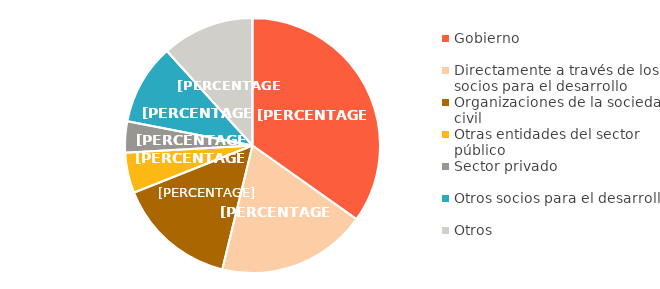
| Category | Series 0 |
|---|---|
| Gobierno | 1161 |
| Directamente a través de los socios para el desarrollo | 634 |
| Organizaciones de la sociedad civil | 506 |
| Otras entidades del sector público | 171 |
| Sector privado | 132 |
| Otros socios para el desarrollo | 341 |
| Otros | 391 |